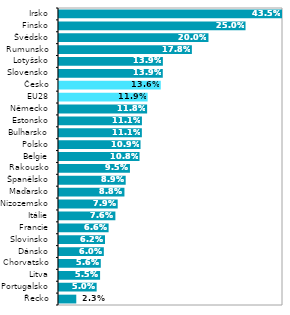
| Category | 2018* |
|---|---|
| Řecko | 0.023 |
| Portugalsko | 0.05 |
| Litva | 0.055 |
| Chorvatsko | 0.056 |
| Dánsko | 0.06 |
| Slovinsko | 0.062 |
| Francie | 0.066 |
| Itálie | 0.076 |
| Nizozemsko | 0.079 |
| Maďarsko | 0.088 |
| Španělsko | 0.089 |
| Rakousko | 0.095 |
| Belgie | 0.108 |
| Polsko | 0.109 |
| Bulharsko | 0.111 |
| Estonsko | 0.111 |
| Německo | 0.118 |
| EU28 | 0.119 |
| Česko | 0.136 |
| Slovensko | 0.139 |
| Lotyšsko | 0.139 |
| Rumunsko | 0.178 |
| Švédsko | 0.2 |
| Finsko | 0.25 |
| Irsko | 0.435 |